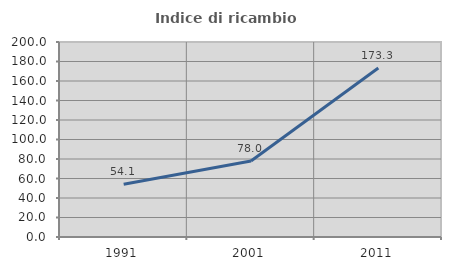
| Category | Indice di ricambio occupazionale  |
|---|---|
| 1991.0 | 54.054 |
| 2001.0 | 78.022 |
| 2011.0 | 173.333 |